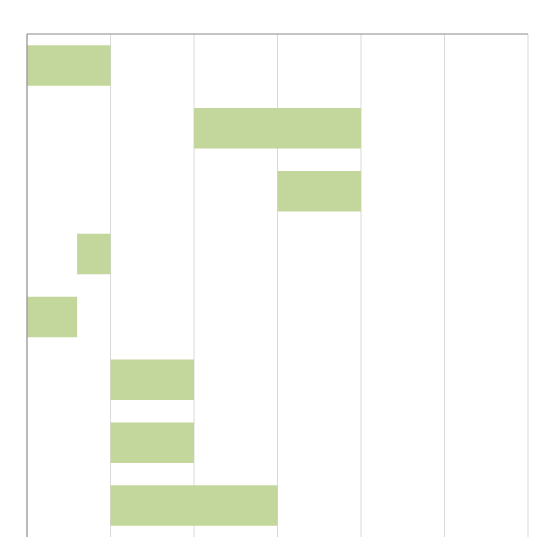
| Category | Series 0 | Series 1 |
|---|---|---|
| 0 | 0 | 0.05 |
| 1 | 0.1 | 0.1 |
| 2 | 0.15 | 0.05 |
| 3 | 0.03 | 0.02 |
| 4 | 0 | 0.03 |
| 5 | 0.05 | 0.05 |
| 6 | 0.05 | 0.05 |
| 7 | 0.05 | 0.1 |